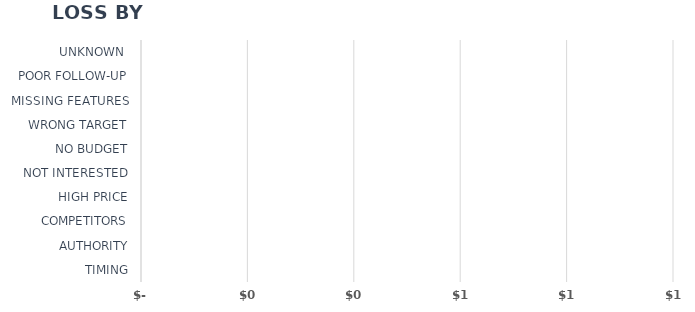
| Category | Series 1 |
|---|---|
| TIMING | 0 |
| AUTHORITY | 0 |
| COMPETITORS | 0 |
| HIGH PRICE | 0 |
| NOT INTERESTED | 0 |
| NO BUDGET | 0 |
| WRONG TARGET | 0 |
| MISSING FEATURES | 0 |
| POOR FOLLOW-UP | 0 |
| UNKNOWN  | 0 |